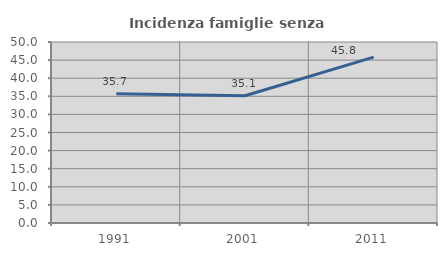
| Category | Incidenza famiglie senza nuclei |
|---|---|
| 1991.0 | 35.731 |
| 2001.0 | 35.135 |
| 2011.0 | 45.812 |